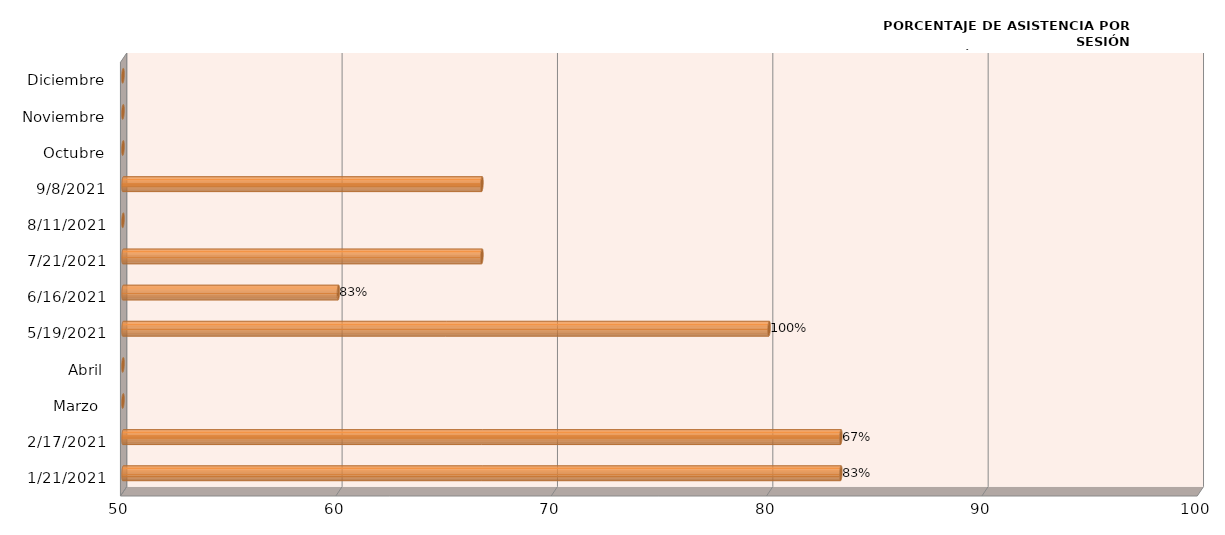
| Category | Series 0 |
|---|---|
| 21/01/2021 | 83.333 |
| 17/02/2021 | 83.333 |
| Marzo  | 0 |
| Abril | 0 |
| 19/05/2021 | 80 |
| 16/06/2021 | 60 |
| 21/07/2021 | 66.667 |
| 11/08/2021 | 50 |
| 08/09/2021 | 66.667 |
| Octubre | 0 |
| Noviembre | 0 |
| Diciembre | 0 |